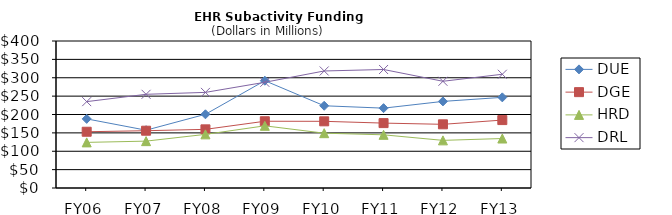
| Category | DUE | DGE | HRD | DRL |
|---|---|---|---|---|
| FY06 | 188.06 | 153.07 | 124.12 | 235.01 |
| FY07 | 157.28 | 155.9 | 127.53 | 254.94 |
| FY08 | 200.56 | 159.59 | 145.94 | 260.17 |
| FY09 | 291.99 | 181.67 | 169.18 | 287.67 |
| FY10 | 223.75 | 181.43 | 149.16 | 318.42 |
| FY11 | 217.28 | 176.58 | 144.71 | 322.47 |
| FY12 | 235.65 | 173.29 | 129.63 | 290.43 |
| FY13 | 246.65 | 184.82 | 134.63 | 309.51 |